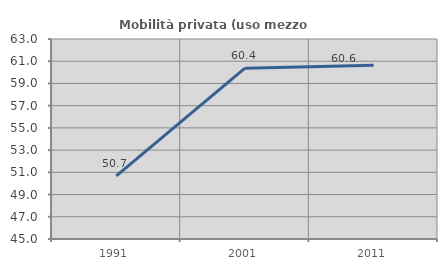
| Category | Mobilità privata (uso mezzo privato) |
|---|---|
| 1991.0 | 50.684 |
| 2001.0 | 60.374 |
| 2011.0 | 60.642 |